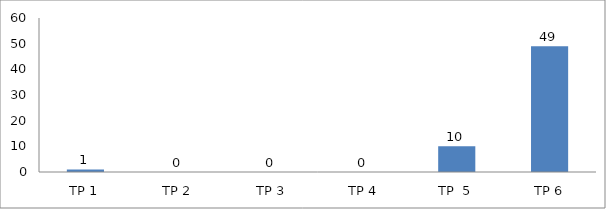
| Category | BIL. MURID |
|---|---|
| TP 1 | 1 |
| TP 2 | 0 |
|  TP 3 | 0 |
| TP 4 | 0 |
| TP  5 | 10 |
| TP 6 | 49 |